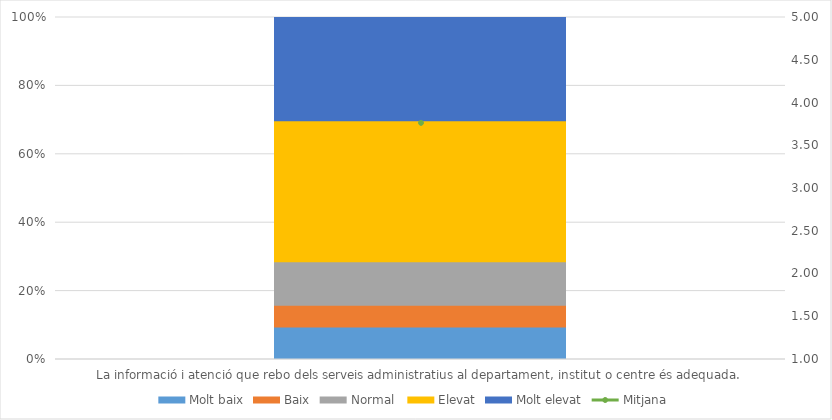
| Category | Molt baix | Baix | Normal  | Elevat | Molt elevat |
|---|---|---|---|---|---|
| La informació i atenció que rebo dels serveis administratius al departament, institut o centre és adequada. | 6 | 4 | 8 | 26 | 19 |